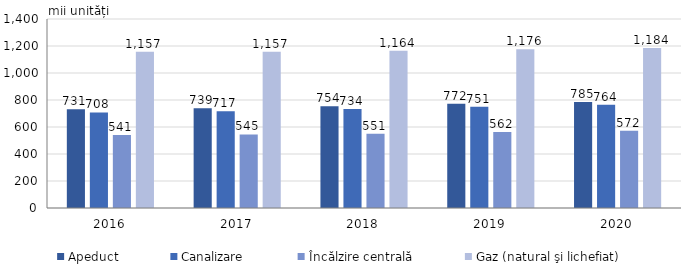
| Category | Apeduct | Canalizare | Încălzire centrală | Gaz (natural şi lichefiat) |
|---|---|---|---|---|
| 2016.0 | 730.606 | 707.574 | 541.256 | 1156.913 |
| 2017.0 | 739.44 | 717.041 | 545.056 | 1157.226 |
| 2018.0 | 754.463 | 733.989 | 550.751 | 1164.38 |
| 2019.0 | 771.768 | 750.924 | 562.472 | 1175.769 |
| 2020.0 | 785 | 764 | 572 | 1184.356 |